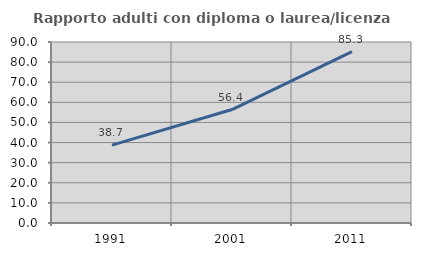
| Category | Rapporto adulti con diploma o laurea/licenza media  |
|---|---|
| 1991.0 | 38.746 |
| 2001.0 | 56.406 |
| 2011.0 | 85.263 |